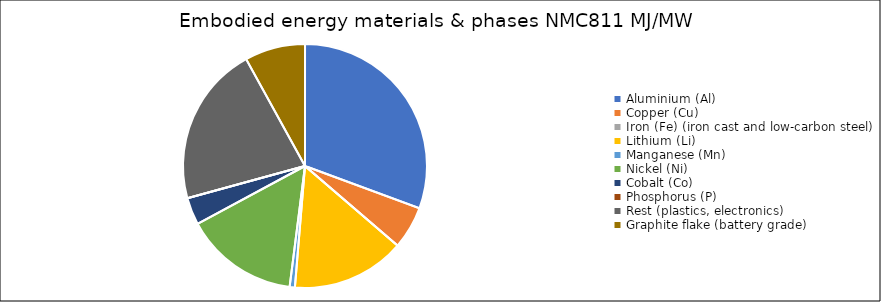
| Category | Embodied energy materials & phases NMC811 |
|---|---|
| Aluminium (Al) | 126278.46 |
| Copper (Cu) | 23397.66 |
| Iron (Fe) (iron cast and low-carbon steel) | 0 |
| Lithium (Li) | 61927.8 |
| Manganese (Mn) | 2863.872 |
| Nickel (Ni) | 62374.653 |
| Cobalt (Co) | 14797.2 |
| Phosphorus (P) | 0 |
| Rest (plastics, electronics) | 87620.225 |
| Graphite flake (battery grade) | 33061.6 |